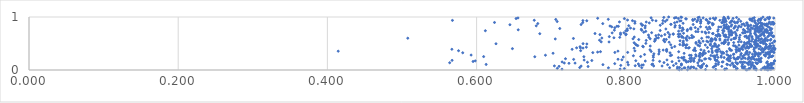
| Category | Series 0 |
|---|---|
| 0.9623171021919199 | 0.001 |
| 0.9747406557323547 | 0.002 |
| 0.9895948987757377 | 0.003 |
| 0.8717175251389123 | 0.004 |
| 0.8827409776190007 | 0.005 |
| 0.9913393225690255 | 0.006 |
| 0.9608940733578318 | 0.007 |
| 0.9814271364665927 | 0.008 |
| 0.9068664954316917 | 0.009 |
| 0.9326719210059154 | 0.01 |
| 0.9944726574568352 | 0.011 |
| 0.9865864142619891 | 0.012 |
| 0.9204823888395895 | 0.013 |
| 0.8750546704846962 | 0.014 |
| 0.9480065491455798 | 0.015 |
| 0.7144841587038178 | 0.016 |
| 0.7923696142282386 | 0.017 |
| 0.972205407511814 | 0.018 |
| 0.964645180021621 | 0.019 |
| 0.8944185041590693 | 0.02 |
| 0.9659850412105353 | 0.021 |
| 0.9329459137267747 | 0.022 |
| 0.869135031206078 | 0.023 |
| 0.9350589281335112 | 0.024 |
| 0.9746266237438452 | 0.025 |
| 0.7980511304339165 | 0.026 |
| 0.8862364519355728 | 0.027 |
| 0.9655324348440759 | 0.028 |
| 0.9493603670472457 | 0.029 |
| 0.70820980556473 | 0.03 |
| 0.9959132565413925 | 0.031 |
| 0.9582505431160309 | 0.032 |
| 0.9974522746776564 | 0.033 |
| 0.9718190202973945 | 0.034 |
| 0.9968156664668084 | 0.035 |
| 0.9875146339542388 | 0.036 |
| 0.992852006151353 | 0.037 |
| 0.9838769126051203 | 0.038 |
| 0.879430409385682 | 0.039 |
| 0.9563827074740291 | 0.04 |
| 0.7767031555499795 | 0.041 |
| 0.8781722413295678 | 0.042 |
| 0.858752318178567 | 0.043 |
| 0.8213729488976601 | 0.044 |
| 0.8913145163075983 | 0.045 |
| 0.738189036426481 | 0.046 |
| 0.8720094785637611 | 0.047 |
| 0.9901740783523252 | 0.048 |
| 0.9000823389358291 | 0.049 |
| 0.901550629968338 | 0.05 |
| 0.9950283732085823 | 0.051 |
| 0.9171286690489323 | 0.052 |
| 0.8905157053189973 | 0.053 |
| 0.8692862677099507 | 0.054 |
| 0.883777177198156 | 0.055 |
| 0.9681171811957827 | 0.056 |
| 0.9573890033942049 | 0.057 |
| 0.887741543517582 | 0.058 |
| 0.986109907274425 | 0.059 |
| 0.9448319364254483 | 0.06 |
| 0.9727542953791875 | 0.061 |
| 0.901876903846437 | 0.062 |
| 0.9595486204015662 | 0.063 |
| 0.9467996678944577 | 0.064 |
| 0.9002018828821146 | 0.065 |
| 0.7494460107641284 | 0.066 |
| 0.9897220579351174 | 0.067 |
| 0.9287786069564016 | 0.068 |
| 0.7105398287959512 | 0.069 |
| 0.9556494420011812 | 0.07 |
| 0.9189533409416853 | 0.071 |
| 0.9085528302026372 | 0.072 |
| 0.971962104768705 | 0.073 |
| 0.7401002572279076 | 0.074 |
| 0.8486193288511875 | 0.075 |
| 0.8373730458030175 | 0.076 |
| 0.7042845908193188 | 0.077 |
| 0.8181570798956572 | 0.078 |
| 0.9083180803463297 | 0.079 |
| 0.9952276723003229 | 0.08 |
| 0.8126287560955953 | 0.081 |
| 0.9207384917934928 | 0.082 |
| 0.897335003783556 | 0.083 |
| 0.9448109345539243 | 0.084 |
| 0.9684124451603641 | 0.085 |
| 0.8639686710516375 | 0.086 |
| 0.793256612609323 | 0.087 |
| 0.9022064757525818 | 0.088 |
| 0.9923580804572758 | 0.089 |
| 0.9908330190778566 | 0.09 |
| 0.9400805765015253 | 0.091 |
| 0.8744944354805781 | 0.092 |
| 0.8214509032997103 | 0.093 |
| 0.9912671017446124 | 0.094 |
| 0.9699162638168138 | 0.095 |
| 0.823451812594991 | 0.096 |
| 0.9916380300341493 | 0.097 |
| 0.8033794882493022 | 0.098 |
| 0.9646386486823598 | 0.099 |
| 0.8560283166008624 | 0.1 |
| 0.7693652457042373 | 0.101 |
| 0.936332315189229 | 0.102 |
| 0.9564513040482068 | 0.103 |
| 0.8349362818269015 | 0.104 |
| 0.6128069580157208 | 0.105 |
| 0.9954770653805188 | 0.106 |
| 0.9239418607885429 | 0.107 |
| 0.8745553616361029 | 0.108 |
| 0.9354507915669162 | 0.109 |
| 0.9911785030127287 | 0.11 |
| 0.8360992602492043 | 0.111 |
| 0.8744563766697384 | 0.112 |
| 0.9677120178402527 | 0.113 |
| 0.8168446358196417 | 0.114 |
| 0.949419500208466 | 0.115 |
| 0.9981077643673135 | 0.116 |
| 0.904402507990802 | 0.117 |
| 0.9207374545474757 | 0.118 |
| 0.9952051277652872 | 0.119 |
| 0.7851628534570525 | 0.12 |
| 0.9428006353074603 | 0.121 |
| 0.8674018352079509 | 0.122 |
| 0.9756192680611138 | 0.123 |
| 0.9943932203333388 | 0.124 |
| 0.9764230527205725 | 0.125 |
| 0.7238270285884756 | 0.126 |
| 0.9497677179717032 | 0.127 |
| 0.9636032887000108 | 0.128 |
| 0.9430386763439812 | 0.129 |
| 0.7319750418950696 | 0.13 |
| 0.9976677351670439 | 0.131 |
| 0.7176094069395006 | 0.132 |
| 0.9624191184293787 | 0.133 |
| 0.8965093738167486 | 0.134 |
| 0.98877732816165 | 0.135 |
| 0.9700727417189179 | 0.136 |
| 0.5639063053985537 | 0.137 |
| 0.9648211120727116 | 0.138 |
| 0.9742678694355028 | 0.139 |
| 0.8511701673877509 | 0.14 |
| 0.9561795174668535 | 0.141 |
| 0.9474611045226818 | 0.142 |
| 0.9245364132184692 | 0.143 |
| 0.9596294175432059 | 0.144 |
| 0.8024030300148874 | 0.145 |
| 0.7485832721935276 | 0.146 |
| 0.9542661012114266 | 0.147 |
| 0.9578027900036609 | 0.148 |
| 0.881379761580431 | 0.149 |
| 0.9531815658848742 | 0.15 |
| 0.9293864886104027 | 0.151 |
| 0.7146346920170109 | 0.152 |
| 0.9670654258154951 | 0.153 |
| 0.9303938028734186 | 0.154 |
| 0.9810513075811355 | 0.155 |
| 0.9897452604131699 | 0.156 |
| 0.9787622420457515 | 0.157 |
| 0.8620182029239735 | 0.158 |
| 0.8838577998714339 | 0.159 |
| 0.9658223570242661 | 0.16 |
| 0.5952861953040963 | 0.161 |
| 0.8912841583687797 | 0.162 |
| 0.8453653778429943 | 0.163 |
| 0.8872105439963486 | 0.164 |
| 0.9807298964556657 | 0.165 |
| 0.8867319858408508 | 0.166 |
| 0.999274374080849 | 0.167 |
| 0.8809362362327201 | 0.168 |
| 0.8261201778190344 | 0.169 |
| 0.9397559192746173 | 0.17 |
| 0.8714227192115594 | 0.171 |
| 0.5981818187261094 | 0.172 |
| 0.8985786720292858 | 0.173 |
| 0.9018751249566416 | 0.174 |
| 0.813410816479047 | 0.175 |
| 0.9994571297483457 | 0.176 |
| 0.9215486012949661 | 0.177 |
| 0.9375773677028879 | 0.178 |
| 0.7544777679440596 | 0.179 |
| 0.9218709125688275 | 0.18 |
| 0.9224036768028829 | 0.181 |
| 0.5671672203813777 | 0.182 |
| 0.8365795420221185 | 0.183 |
| 0.9201306101824852 | 0.184 |
| 0.8907741191613138 | 0.185 |
| 0.9782969067538114 | 0.186 |
| 0.8779519247450639 | 0.187 |
| 0.7441566349024814 | 0.188 |
| 0.8792302531380817 | 0.189 |
| 0.8551905567840165 | 0.19 |
| 0.9769319252743411 | 0.191 |
| 0.7947451553659325 | 0.192 |
| 0.9198630655265986 | 0.193 |
| 0.9800841127188177 | 0.194 |
| 0.9380014721778946 | 0.195 |
| 0.9728680919805304 | 0.196 |
| 0.9752626883464894 | 0.197 |
| 0.8986561116956667 | 0.198 |
| 0.9473557231925827 | 0.199 |
| 0.7300938349458465 | 0.2 |
| 0.9356826834111606 | 0.201 |
| 0.9683160513984529 | 0.202 |
| 0.7895908632888478 | 0.203 |
| 0.9637731427460118 | 0.204 |
| 0.9133536432225104 | 0.205 |
| 0.9783421481849114 | 0.206 |
| 0.9793683599320218 | 0.207 |
| 0.9056707741381134 | 0.208 |
| 0.9551656661748434 | 0.209 |
| 0.8880777229853094 | 0.21 |
| 0.9070310059133708 | 0.211 |
| 0.9501777677584241 | 0.212 |
| 0.7191661486997022 | 0.213 |
| 0.9490064521492896 | 0.214 |
| 0.945560627218099 | 0.215 |
| 0.8858590834009079 | 0.216 |
| 0.9713622452815149 | 0.217 |
| 0.9117565424634698 | 0.218 |
| 0.949810817384953 | 0.219 |
| 0.9601066817891463 | 0.22 |
| 0.8919211240006958 | 0.221 |
| 0.9403649649705264 | 0.222 |
| 0.981562833353997 | 0.223 |
| 0.9370962412439288 | 0.224 |
| 0.8764673228641607 | 0.225 |
| 0.8767542933571675 | 0.226 |
| 0.9663277955692567 | 0.227 |
| 0.9190654770256185 | 0.228 |
| 0.9576403746326465 | 0.229 |
| 0.991316346669738 | 0.23 |
| 0.96567294693632 | 0.231 |
| 0.8747457762014706 | 0.232 |
| 0.8705212757419526 | 0.233 |
| 0.9447054397809272 | 0.234 |
| 0.931819839055573 | 0.235 |
| 0.8878443036063134 | 0.236 |
| 0.950259983141941 | 0.237 |
| 0.9235755151511068 | 0.238 |
| 0.9647531415200777 | 0.239 |
| 0.8369447365486891 | 0.24 |
| 0.9279118435210593 | 0.241 |
| 0.8779978769096145 | 0.242 |
| 0.9523938043702941 | 0.243 |
| 0.9700721068888977 | 0.244 |
| 0.7966493492338929 | 0.245 |
| 0.920003771731342 | 0.246 |
| 0.8994935628284023 | 0.247 |
| 0.9695801711051848 | 0.248 |
| 0.9928888202121999 | 0.249 |
| 0.6780223085672129 | 0.25 |
| 0.7438046785874354 | 0.251 |
| 0.9389284555280845 | 0.252 |
| 0.6094406604966417 | 0.253 |
| 0.9952535711270178 | 0.254 |
| 0.8199231946147361 | 0.255 |
| 0.994863272327541 | 0.256 |
| 0.9567454307997046 | 0.257 |
| 0.9779776465184266 | 0.258 |
| 0.99630381439143 | 0.259 |
| 0.8982823710452098 | 0.26 |
| 0.8941469743174628 | 0.261 |
| 0.9871604140682936 | 0.262 |
| 0.9726975046387105 | 0.263 |
| 0.9170908342759513 | 0.264 |
| 0.9278738752091026 | 0.265 |
| 0.9192699051250406 | 0.266 |
| 0.997193834581434 | 0.267 |
| 0.9404234419164634 | 0.268 |
| 0.8101548516680317 | 0.269 |
| 0.9377023063002525 | 0.27 |
| 0.8368906884591492 | 0.271 |
| 0.8597195190872771 | 0.272 |
| 0.9140672487799405 | 0.273 |
| 0.9026513746955949 | 0.274 |
| 0.8984094469744726 | 0.275 |
| 0.9733369412372919 | 0.276 |
| 0.8854119841052089 | 0.277 |
| 0.8876557428219899 | 0.278 |
| 0.6922829438955932 | 0.279 |
| 0.8613290826898503 | 0.28 |
| 0.9588559384708554 | 0.281 |
| 0.5926620306555591 | 0.282 |
| 0.9855847963279057 | 0.283 |
| 0.9221458558985155 | 0.284 |
| 0.9540607703301839 | 0.285 |
| 0.9644133966646258 | 0.286 |
| 0.893694061664823 | 0.287 |
| 0.9875065102819928 | 0.288 |
| 0.977484083341017 | 0.289 |
| 0.935624392224458 | 0.29 |
| 0.9920814820060264 | 0.291 |
| 0.8251613603771011 | 0.292 |
| 0.9735155484849944 | 0.293 |
| 0.9441884482239455 | 0.294 |
| 0.9775653795994088 | 0.295 |
| 0.904164657472954 | 0.296 |
| 0.992565128692091 | 0.297 |
| 0.9800383730047943 | 0.298 |
| 0.9698408017986667 | 0.299 |
| 0.9449418528973346 | 0.3 |
| 0.903261533530312 | 0.301 |
| 0.8441888971537328 | 0.302 |
| 0.9613341076515183 | 0.303 |
| 0.9898767498723523 | 0.304 |
| 0.9742387312797501 | 0.305 |
| 0.8376678192373866 | 0.306 |
| 0.9001510361703876 | 0.307 |
| 0.9735079523210072 | 0.308 |
| 0.9803883124469166 | 0.309 |
| 0.8997198604893878 | 0.31 |
| 0.9288892887346667 | 0.311 |
| 0.954776959173555 | 0.312 |
| 0.899487314139971 | 0.313 |
| 0.8781714434586686 | 0.314 |
| 0.9750751322182978 | 0.315 |
| 0.7025093517955548 | 0.316 |
| 0.9314236945204531 | 0.317 |
| 0.9066889683442864 | 0.318 |
| 0.9780397703918858 | 0.319 |
| 0.9607959166329306 | 0.32 |
| 0.9901277215762986 | 0.321 |
| 0.9627003367917528 | 0.322 |
| 0.9876110538723348 | 0.323 |
| 0.8592562482992995 | 0.324 |
| 0.5813936628955948 | 0.325 |
| 0.9896496578903315 | 0.326 |
| 0.9159628978978699 | 0.327 |
| 0.7557689928263147 | 0.328 |
| 0.9661442217232942 | 0.329 |
| 0.9986326676820337 | 0.33 |
| 0.7853485007490797 | 0.331 |
| 0.8025428539912068 | 0.332 |
| 0.9939454803933644 | 0.333 |
| 0.9040102100158718 | 0.334 |
| 0.9223738606408703 | 0.335 |
| 0.9299549534549396 | 0.336 |
| 0.9827369682065333 | 0.337 |
| 0.762235052709559 | 0.338 |
| 0.9481424614612068 | 0.339 |
| 0.9922299919421947 | 0.34 |
| 0.9974861036955619 | 0.341 |
| 0.984224095635406 | 0.342 |
| 0.8448723728392621 | 0.343 |
| 0.9728622211684995 | 0.344 |
| 0.8709185654625136 | 0.345 |
| 0.7660622575870332 | 0.346 |
| 0.92697503192385 | 0.347 |
| 0.911073953800782 | 0.348 |
| 0.9353623923120121 | 0.349 |
| 0.8340353042125992 | 0.35 |
| 0.9724096402623796 | 0.351 |
| 0.8548469254521991 | 0.352 |
| 0.9626248656735368 | 0.353 |
| 0.9622317544065602 | 0.354 |
| 0.4144857685913823 | 0.355 |
| 0.7894900357652568 | 0.356 |
| 0.9157757948965741 | 0.357 |
| 0.9231067688740331 | 0.358 |
| 0.9955175491821857 | 0.359 |
| 0.9204761420584558 | 0.36 |
| 0.812234976753922 | 0.361 |
| 0.9525971960055384 | 0.362 |
| 0.8933811592944205 | 0.363 |
| 0.5758143629004565 | 0.364 |
| 0.7394729094511923 | 0.365 |
| 0.9050011103941197 | 0.366 |
| 0.995134652663574 | 0.367 |
| 0.9951107734956424 | 0.368 |
| 0.9511717610633147 | 0.369 |
| 0.9417520348564682 | 0.37 |
| 0.9491051385457157 | 0.371 |
| 0.8907727454850652 | 0.372 |
| 0.8546191864476756 | 0.373 |
| 0.9846532907947252 | 0.374 |
| 0.9399599442000579 | 0.375 |
| 0.8501029826752423 | 0.376 |
| 0.9220054203055924 | 0.377 |
| 0.8921115378831099 | 0.378 |
| 0.9404396400458778 | 0.379 |
| 0.8445983238426278 | 0.38 |
| 0.8324013216394454 | 0.381 |
| 0.9007337383681668 | 0.382 |
| 0.9813489370834647 | 0.383 |
| 0.9995004602389648 | 0.384 |
| 0.9477764269962318 | 0.385 |
| 0.9718148723110704 | 0.386 |
| 0.9568644046345147 | 0.387 |
| 0.8547420291051253 | 0.388 |
| 0.9395800905368379 | 0.389 |
| 0.7280599603449569 | 0.39 |
| 0.5668644529611616 | 0.391 |
| 0.9984280531620554 | 0.392 |
| 0.9249858247908266 | 0.393 |
| 0.9915091305394632 | 0.394 |
| 0.9865942167625935 | 0.395 |
| 0.9855121849808205 | 0.396 |
| 0.9517040051233362 | 0.397 |
| 0.95165691800968 | 0.398 |
| 0.954224034754819 | 0.399 |
| 0.9785188113318322 | 0.4 |
| 0.9151106581051693 | 0.401 |
| 0.9999741392984134 | 0.402 |
| 0.6480353742177841 | 0.403 |
| 0.998227365445026 | 0.404 |
| 0.9388861000831965 | 0.405 |
| 0.9552056144749408 | 0.406 |
| 0.9828217062161628 | 0.407 |
| 0.9964389593440388 | 0.408 |
| 0.9607875749832318 | 0.409 |
| 0.9874648456047526 | 0.41 |
| 0.8111660571426745 | 0.411 |
| 0.9643698660073264 | 0.412 |
| 0.8924862773541672 | 0.413 |
| 0.7426664429702238 | 0.414 |
| 0.8838579590734182 | 0.415 |
| 0.9936637115815524 | 0.416 |
| 0.7391884758723936 | 0.417 |
| 0.7340481666846946 | 0.418 |
| 0.9721517447963297 | 0.419 |
| 0.8805961311417265 | 0.42 |
| 0.885105587260702 | 0.421 |
| 0.8617764225790171 | 0.422 |
| 0.9985922077223991 | 0.423 |
| 0.9094448615010557 | 0.424 |
| 0.9885569710817365 | 0.425 |
| 0.9741404242186155 | 0.426 |
| 0.9487899667537087 | 0.427 |
| 0.9869963375213793 | 0.428 |
| 0.9903548128535696 | 0.429 |
| 0.7471122260250312 | 0.43 |
| 0.9626927388246276 | 0.431 |
| 0.9658320431943264 | 0.432 |
| 0.9229706578212544 | 0.433 |
| 0.9556584381264462 | 0.434 |
| 0.9477260021561735 | 0.435 |
| 0.9752536494785555 | 0.436 |
| 0.9585330835892327 | 0.437 |
| 0.8235073825662268 | 0.438 |
| 0.9656756830942297 | 0.439 |
| 0.7386736607450084 | 0.44 |
| 0.9802772852144014 | 0.441 |
| 0.9213297539987884 | 0.442 |
| 0.9157947694769544 | 0.443 |
| 0.8656169127774805 | 0.444 |
| 0.9626830098165101 | 0.445 |
| 0.918185480546576 | 0.446 |
| 0.8226550886852281 | 0.447 |
| 0.9684689854313506 | 0.448 |
| 0.992351680721069 | 0.449 |
| 0.9940726421393083 | 0.45 |
| 0.9690637870682206 | 0.451 |
| 0.8327473131863227 | 0.452 |
| 0.9941777232853511 | 0.453 |
| 0.8988625797907606 | 0.454 |
| 0.9574196541378748 | 0.455 |
| 0.9464001104884747 | 0.456 |
| 0.9980090828559504 | 0.457 |
| 0.9782885969370932 | 0.458 |
| 0.9755302445268572 | 0.459 |
| 0.8160645362747778 | 0.46 |
| 0.944252614700311 | 0.461 |
| 0.974906578979702 | 0.462 |
| 0.92466540510118 | 0.463 |
| 0.8806399742568018 | 0.464 |
| 0.8764599759653738 | 0.465 |
| 0.95786293241289 | 0.466 |
| 0.8968080407413324 | 0.467 |
| 0.951645341120223 | 0.468 |
| 0.9767385776986013 | 0.469 |
| 0.8144591951541297 | 0.47 |
| 0.9066137922211386 | 0.471 |
| 0.8776423305610597 | 0.472 |
| 0.9131192365420557 | 0.473 |
| 0.9880075118362897 | 0.474 |
| 0.9193723918571268 | 0.475 |
| 0.8602171259399222 | 0.476 |
| 0.8818529941730048 | 0.477 |
| 0.9882788083032351 | 0.478 |
| 0.9593919605187603 | 0.479 |
| 0.8725062767076271 | 0.48 |
| 0.9667048404360538 | 0.481 |
| 0.9200518916297831 | 0.482 |
| 0.9373042324343713 | 0.483 |
| 0.9731896805325541 | 0.484 |
| 0.967248250162515 | 0.485 |
| 0.8130557810273682 | 0.486 |
| 0.9727988626080961 | 0.487 |
| 0.8778712277505104 | 0.488 |
| 0.9136270047631027 | 0.489 |
| 0.9659750168222409 | 0.49 |
| 0.7478033575163373 | 0.491 |
| 0.976485840121418 | 0.492 |
| 0.9750987052809064 | 0.493 |
| 0.9933832585096435 | 0.494 |
| 0.6260008788841602 | 0.495 |
| 0.9872338989313928 | 0.496 |
| 0.7427246690705369 | 0.497 |
| 0.9193150482586967 | 0.498 |
| 0.9843164248882441 | 0.499 |
| 0.9312505693030634 | 0.5 |
| 0.894268829096236 | 0.501 |
| 0.8268696235158256 | 0.502 |
| 0.9620134802614648 | 0.503 |
| 0.9319992505605785 | 0.504 |
| 0.8999736736426558 | 0.505 |
| 0.9619718348973573 | 0.506 |
| 0.9286712435274185 | 0.507 |
| 0.9307611551909901 | 0.508 |
| 0.9740625564304165 | 0.509 |
| 0.9965609922829083 | 0.51 |
| 0.9631592982861954 | 0.511 |
| 0.9379210028274486 | 0.512 |
| 0.9631608949971341 | 0.513 |
| 0.8111735726085137 | 0.514 |
| 0.8767197278736854 | 0.515 |
| 0.9808657586131827 | 0.516 |
| 0.9446499344650036 | 0.517 |
| 0.9588479585128276 | 0.518 |
| 0.9805206258468796 | 0.519 |
| 0.8940925800432205 | 0.52 |
| 0.9315200649129343 | 0.521 |
| 0.9720211110301873 | 0.522 |
| 0.982650199443754 | 0.523 |
| 0.8581133427127303 | 0.524 |
| 0.9851402247753328 | 0.525 |
| 0.9335424636556627 | 0.526 |
| 0.8982270103186315 | 0.527 |
| 0.9103311590375732 | 0.528 |
| 0.7775424461515755 | 0.529 |
| 0.9509941113102894 | 0.53 |
| 0.7670312391458513 | 0.531 |
| 0.9546415548883564 | 0.532 |
| 0.8522565219138749 | 0.533 |
| 0.9329637238920975 | 0.534 |
| 0.9828474108831092 | 0.535 |
| 0.972917827175685 | 0.536 |
| 0.9994382502239354 | 0.537 |
| 0.9653843947203534 | 0.538 |
| 0.9728762838125853 | 0.539 |
| 0.9655506782877296 | 0.54 |
| 0.9150117509967051 | 0.541 |
| 0.8385816275126364 | 0.542 |
| 0.9035859470550575 | 0.543 |
| 0.9085769033694665 | 0.544 |
| 0.9685806493685396 | 0.545 |
| 0.8771481699515653 | 0.546 |
| 0.9135982296539724 | 0.547 |
| 0.9871390642199049 | 0.548 |
| 0.9993318132141781 | 0.549 |
| 0.8981163788593188 | 0.55 |
| 0.8727242477435442 | 0.551 |
| 0.9752808327368546 | 0.552 |
| 0.9847298340401586 | 0.553 |
| 0.9779464317396352 | 0.554 |
| 0.9839500445295968 | 0.555 |
| 0.8508214006544697 | 0.556 |
| 0.9900923380443168 | 0.557 |
| 0.8273729570575161 | 0.558 |
| 0.9329231675006803 | 0.559 |
| 0.8819753394857331 | 0.56 |
| 0.993760784832283 | 0.561 |
| 0.7648215765941162 | 0.562 |
| 0.9740242145295216 | 0.563 |
| 0.8395420762937958 | 0.564 |
| 0.9262550374968116 | 0.565 |
| 0.9206446236271634 | 0.566 |
| 0.9331200369696578 | 0.567 |
| 0.9366030900469937 | 0.568 |
| 0.9898485669811828 | 0.569 |
| 0.9162740168714949 | 0.57 |
| 0.9744568745243392 | 0.571 |
| 0.9412923101313996 | 0.572 |
| 0.9802536361688297 | 0.573 |
| 0.8173443357077528 | 0.574 |
| 0.914602633246495 | 0.575 |
| 0.9523553826084585 | 0.576 |
| 0.8542841619341728 | 0.577 |
| 0.8513667381741556 | 0.578 |
| 0.9204671570942051 | 0.579 |
| 0.9945452533968762 | 0.58 |
| 0.8391640219677485 | 0.581 |
| 0.9863182918337174 | 0.582 |
| 0.96993073781206 | 0.583 |
| 0.9653838593272214 | 0.584 |
| 0.9142628552964118 | 0.585 |
| 0.7054506998507126 | 0.586 |
| 0.9260360337998497 | 0.587 |
| 0.8096681242526899 | 0.588 |
| 0.8326850906421477 | 0.589 |
| 0.9820569095407243 | 0.59 |
| 0.9151885716430844 | 0.591 |
| 0.8807467161333962 | 0.592 |
| 0.9452287134140008 | 0.593 |
| 0.9196931795429173 | 0.594 |
| 0.7297769866966531 | 0.595 |
| 0.9449640184168617 | 0.596 |
| 0.9470734149117338 | 0.597 |
| 0.9017177871537524 | 0.598 |
| 0.9778615019593837 | 0.599 |
| 0.5077611199360021 | 0.6 |
| 0.8805332895877416 | 0.601 |
| 0.9874563083968086 | 0.602 |
| 0.7678871975379378 | 0.603 |
| 0.8854002968869205 | 0.604 |
| 0.8415742371154734 | 0.605 |
| 0.962457474089988 | 0.606 |
| 0.8436383828701505 | 0.607 |
| 0.7840599667158346 | 0.608 |
| 0.9754754814120234 | 0.609 |
| 0.8887697534338266 | 0.61 |
| 0.9468526414619998 | 0.611 |
| 0.9522136682109794 | 0.612 |
| 0.876933216417821 | 0.613 |
| 0.9378089453387154 | 0.614 |
| 0.9642944101824813 | 0.615 |
| 0.7918812655176978 | 0.616 |
| 0.9689870270306957 | 0.617 |
| 0.831000540780624 | 0.618 |
| 0.9108941702763041 | 0.619 |
| 0.8749434161807583 | 0.62 |
| 0.9086719044090436 | 0.621 |
| 0.8113558585800854 | 0.622 |
| 0.8581578269413005 | 0.623 |
| 0.8907909166606329 | 0.624 |
| 0.9346623642297838 | 0.625 |
| 0.8709857750866713 | 0.626 |
| 0.934034303764575 | 0.627 |
| 0.9979068189944336 | 0.628 |
| 0.9904388644661957 | 0.629 |
| 0.7779024673038556 | 0.63 |
| 0.9778429671835873 | 0.631 |
| 0.969057594522465 | 0.632 |
| 0.9596319420495242 | 0.633 |
| 0.8709977937890238 | 0.634 |
| 0.9228178045867875 | 0.635 |
| 0.8823740386556644 | 0.636 |
| 0.9967710423326367 | 0.637 |
| 0.8748717618842354 | 0.638 |
| 0.9321481082074679 | 0.639 |
| 0.9615804786484419 | 0.64 |
| 0.9980508063597097 | 0.641 |
| 0.9262695735709582 | 0.642 |
| 0.9329106662898341 | 0.643 |
| 0.8477700802588518 | 0.644 |
| 0.980378496385256 | 0.645 |
| 0.9749726066501064 | 0.646 |
| 0.9658879455437285 | 0.647 |
| 0.985586337486836 | 0.648 |
| 0.8403738916267488 | 0.649 |
| 0.9918388179688139 | 0.65 |
| 0.9484215497173363 | 0.651 |
| 0.888400549008162 | 0.652 |
| 0.9394188124149866 | 0.653 |
| 0.9208104490802919 | 0.654 |
| 0.925854510661014 | 0.655 |
| 0.9532758651743055 | 0.656 |
| 0.9946919721842576 | 0.657 |
| 0.9315330286597848 | 0.658 |
| 0.8304101795153574 | 0.659 |
| 0.9337858124224444 | 0.66 |
| 0.9419423189988549 | 0.661 |
| 0.9744447543675503 | 0.662 |
| 0.8440363747527883 | 0.663 |
| 0.9812076664668152 | 0.664 |
| 0.981008500115985 | 0.665 |
| 0.7999398817235461 | 0.666 |
| 0.8588143405595523 | 0.667 |
| 0.7653459886180548 | 0.668 |
| 0.8523740789330779 | 0.669 |
| 0.7929849638340251 | 0.67 |
| 0.9238089514899172 | 0.671 |
| 0.9245340542066932 | 0.672 |
| 0.8703287413250961 | 0.673 |
| 0.8636161736460964 | 0.674 |
| 0.8005330919321839 | 0.675 |
| 0.9385052496891074 | 0.676 |
| 0.9828637245282569 | 0.677 |
| 0.872574057526707 | 0.678 |
| 0.9414553588539427 | 0.679 |
| 0.9846410761919925 | 0.68 |
| 0.947445638838303 | 0.681 |
| 0.8635266662395696 | 0.682 |
| 0.9673552190507891 | 0.683 |
| 0.9850156226763952 | 0.684 |
| 0.6847334685207027 | 0.685 |
| 0.9730030861417517 | 0.686 |
| 0.9163200156534317 | 0.687 |
| 0.7587192784496638 | 0.688 |
| 0.9170261005926562 | 0.689 |
| 0.9931630278315654 | 0.69 |
| 0.991724449315896 | 0.691 |
| 0.9952820317170362 | 0.692 |
| 0.8774116713379745 | 0.693 |
| 0.9072583928497545 | 0.694 |
| 0.973063335416825 | 0.695 |
| 0.7929253815239549 | 0.696 |
| 0.9834325315116433 | 0.697 |
| 0.9301702739650884 | 0.698 |
| 0.9572928446088304 | 0.699 |
| 0.7817252184093995 | 0.7 |
| 0.959852306035162 | 0.701 |
| 0.7975168315026822 | 0.702 |
| 0.9565847256199441 | 0.703 |
| 0.8346286211144188 | 0.704 |
| 0.9435004960958935 | 0.705 |
| 0.9957755631259012 | 0.706 |
| 0.8566009382659847 | 0.707 |
| 0.9113031375435687 | 0.708 |
| 0.9848975669391568 | 0.709 |
| 0.9786307084556118 | 0.71 |
| 0.9600441750395505 | 0.711 |
| 0.9892334049186314 | 0.712 |
| 0.8240825709615288 | 0.713 |
| 0.9466352890079398 | 0.714 |
| 0.9064995011071078 | 0.715 |
| 0.9732431414372331 | 0.716 |
| 0.9887570621593448 | 0.717 |
| 0.9668523016892777 | 0.718 |
| 0.9021277110796131 | 0.719 |
| 0.938095226061933 | 0.72 |
| 0.9406673027674779 | 0.721 |
| 0.9634728682596763 | 0.722 |
| 0.9603883340005797 | 0.723 |
| 0.896808797986868 | 0.724 |
| 0.8938980297917998 | 0.725 |
| 0.9410823725954339 | 0.726 |
| 0.9743462844931816 | 0.727 |
| 0.9865472635421945 | 0.728 |
| 0.8267688358678603 | 0.729 |
| 0.9795961264206604 | 0.73 |
| 0.9232913761374831 | 0.731 |
| 0.8708005311619416 | 0.732 |
| 0.9763298170044926 | 0.733 |
| 0.980252450332906 | 0.734 |
| 0.9316462928086313 | 0.735 |
| 0.9820246913825474 | 0.736 |
| 0.9900866997303482 | 0.737 |
| 0.7999405203287809 | 0.738 |
| 0.874976448928469 | 0.739 |
| 0.8824029297621193 | 0.74 |
| 0.6117578290728908 | 0.741 |
| 0.9595146344445376 | 0.742 |
| 0.9763350397076801 | 0.743 |
| 0.9410848733929656 | 0.744 |
| 0.8461102944148516 | 0.745 |
| 0.8020957265460227 | 0.746 |
| 0.9298297518980387 | 0.747 |
| 0.9941302958976259 | 0.748 |
| 0.8214692628274519 | 0.749 |
| 0.9777725299528658 | 0.75 |
| 0.7847037004547389 | 0.751 |
| 0.9862742243068369 | 0.752 |
| 0.9494153836337145 | 0.753 |
| 0.9872349537884539 | 0.754 |
| 0.9579899375432573 | 0.755 |
| 0.9671452193160538 | 0.756 |
| 0.9378114321984699 | 0.757 |
| 0.6557804207900783 | 0.758 |
| 0.9729258670897443 | 0.759 |
| 0.9937659747927513 | 0.76 |
| 0.9238327457584605 | 0.761 |
| 0.882597441738098 | 0.762 |
| 0.9651904956620216 | 0.763 |
| 0.9576366918485969 | 0.764 |
| 0.9887746929553073 | 0.765 |
| 0.8770074686851682 | 0.766 |
| 0.9816864097015993 | 0.767 |
| 0.9097900516240319 | 0.768 |
| 0.8207237392882618 | 0.769 |
| 0.9819118436652615 | 0.77 |
| 0.8875576664759183 | 0.771 |
| 0.9739084301114207 | 0.772 |
| 0.8969219448331814 | 0.773 |
| 0.8537002261330926 | 0.774 |
| 0.801993252281169 | 0.775 |
| 0.8108322762208109 | 0.776 |
| 0.9797293875856269 | 0.777 |
| 0.9957279893588592 | 0.778 |
| 0.9358335140103552 | 0.779 |
| 0.8865355897180329 | 0.78 |
| 0.9130739045583266 | 0.781 |
| 0.9764713918208888 | 0.782 |
| 0.711499368238944 | 0.783 |
| 0.9314969260237578 | 0.784 |
| 0.9701254728143085 | 0.785 |
| 0.9633405483496169 | 0.786 |
| 0.944948508907034 | 0.787 |
| 0.9938094530036642 | 0.788 |
| 0.937686005251603 | 0.789 |
| 0.9842593798122725 | 0.79 |
| 0.8063136741032725 | 0.791 |
| 0.9740468143542428 | 0.792 |
| 0.8760820767713877 | 0.793 |
| 0.8258523629450855 | 0.794 |
| 0.8872888000846226 | 0.795 |
| 0.872473220087274 | 0.796 |
| 0.7852135135025888 | 0.797 |
| 0.9340908188247383 | 0.798 |
| 0.9679453257948717 | 0.799 |
| 0.8930846121478264 | 0.8 |
| 0.9504532123396393 | 0.801 |
| 0.9789172213745108 | 0.802 |
| 0.9346409168775681 | 0.803 |
| 0.9324028178709428 | 0.804 |
| 0.9759216699226775 | 0.805 |
| 0.9079737175113183 | 0.806 |
| 0.9460010160288902 | 0.807 |
| 0.9920072799310753 | 0.808 |
| 0.8657684067290695 | 0.809 |
| 0.9119855364769247 | 0.81 |
| 0.924647036479842 | 0.811 |
| 0.9381756834036644 | 0.812 |
| 0.9276559658178197 | 0.813 |
| 0.9544676729239976 | 0.814 |
| 0.7811315276056586 | 0.815 |
| 0.9001958241455744 | 0.816 |
| 0.9347367915475945 | 0.817 |
| 0.9827480136647282 | 0.818 |
| 0.9762688474812035 | 0.819 |
| 0.9373954803103041 | 0.82 |
| 0.9639472409392698 | 0.821 |
| 0.9799132392915778 | 0.822 |
| 0.990127760548573 | 0.823 |
| 0.7900514320778832 | 0.824 |
| 0.7880155927536308 | 0.825 |
| 0.9411585637356016 | 0.826 |
| 0.9647932089405044 | 0.827 |
| 0.9470011377974871 | 0.828 |
| 0.9715860561388315 | 0.829 |
| 0.778782850819824 | 0.83 |
| 0.9517927170696894 | 0.831 |
| 0.8261497252556488 | 0.832 |
| 0.679980531188846 | 0.833 |
| 0.8722659473599956 | 0.834 |
| 0.9739567097044848 | 0.835 |
| 0.8039565657353694 | 0.836 |
| 0.9886515841430792 | 0.837 |
| 0.8663839620175476 | 0.838 |
| 0.9596437783049808 | 0.839 |
| 0.9319007309311249 | 0.84 |
| 0.9816569727660722 | 0.841 |
| 0.8219507658534884 | 0.842 |
| 0.9317147584413906 | 0.843 |
| 0.8461955500159615 | 0.844 |
| 0.9674372851345434 | 0.845 |
| 0.9825858992466144 | 0.846 |
| 0.9631049423958074 | 0.847 |
| 0.8224837353714244 | 0.848 |
| 0.986420861627839 | 0.849 |
| 0.9879836848193664 | 0.85 |
| 0.9163712810157534 | 0.851 |
| 0.9638886530992946 | 0.852 |
| 0.942047682897954 | 0.853 |
| 0.6446467240927429 | 0.854 |
| 0.9828998392469585 | 0.855 |
| 0.9762940316056374 | 0.856 |
| 0.9349427011089427 | 0.857 |
| 0.7400813907585575 | 0.858 |
| 0.8903276889000192 | 0.859 |
| 0.9557405450254576 | 0.86 |
| 0.9976014533743855 | 0.861 |
| 0.8605910461581265 | 0.862 |
| 0.8604138041991591 | 0.863 |
| 0.9945904096464647 | 0.864 |
| 0.9861463600275658 | 0.865 |
| 0.9173644902131008 | 0.866 |
| 0.9824940979844433 | 0.867 |
| 0.9885498933208632 | 0.868 |
| 0.9818807298819106 | 0.869 |
| 0.9578700814107194 | 0.87 |
| 0.9909176871732808 | 0.871 |
| 0.8204873375471424 | 0.872 |
| 0.983451920045795 | 0.873 |
| 0.982201900956818 | 0.874 |
| 0.7691234140820816 | 0.875 |
| 0.682036275556129 | 0.876 |
| 0.998703636378072 | 0.877 |
| 0.9158877825565418 | 0.878 |
| 0.8493457342444253 | 0.879 |
| 0.9105574350404462 | 0.88 |
| 0.8768151818535123 | 0.881 |
| 0.8122256370840156 | 0.882 |
| 0.9002454875728823 | 0.883 |
| 0.9917422166090412 | 0.884 |
| 0.9781133052159335 | 0.885 |
| 0.9740386969189083 | 0.886 |
| 0.961984103942548 | 0.887 |
| 0.8315241672507194 | 0.888 |
| 0.9625734202362497 | 0.889 |
| 0.9464238304606198 | 0.89 |
| 0.8653998267441061 | 0.891 |
| 0.949437247730747 | 0.892 |
| 0.9287165973115161 | 0.893 |
| 0.7422435620410128 | 0.894 |
| 0.9397262845205978 | 0.895 |
| 0.9298502579829881 | 0.896 |
| 0.624013300201857 | 0.897 |
| 0.9803952537297748 | 0.898 |
| 0.9961525130414893 | 0.899 |
| 0.9121662934104842 | 0.9 |
| 0.9974693658551093 | 0.901 |
| 0.9316353797614836 | 0.902 |
| 0.9326297143697662 | 0.903 |
| 0.9927109582613699 | 0.904 |
| 0.8273767758821722 | 0.905 |
| 0.8686693652776595 | 0.906 |
| 0.7914806320826212 | 0.907 |
| 0.9726719945679473 | 0.908 |
| 0.9498741421952621 | 0.909 |
| 0.9452840794568732 | 0.91 |
| 0.9004496652815979 | 0.911 |
| 0.9103161392806584 | 0.912 |
| 0.8953305978468244 | 0.913 |
| 0.8121421127703194 | 0.914 |
| 0.7079804529760179 | 0.915 |
| 0.852893291345395 | 0.916 |
| 0.9343673889926936 | 0.917 |
| 0.9540522565020269 | 0.918 |
| 0.9004164726373964 | 0.919 |
| 0.9303613120542493 | 0.92 |
| 0.9416301765047508 | 0.921 |
| 0.9313738592969806 | 0.922 |
| 0.9422748111925617 | 0.923 |
| 0.9421072302895517 | 0.924 |
| 0.9694604387483526 | 0.925 |
| 0.872267835000152 | 0.926 |
| 0.8740168178916432 | 0.927 |
| 0.8405018800939652 | 0.928 |
| 0.747703921758477 | 0.929 |
| 0.9770651481299503 | 0.93 |
| 0.8089454522050544 | 0.931 |
| 0.7425334355637935 | 0.932 |
| 0.8497919216386565 | 0.933 |
| 0.8899827786550605 | 0.934 |
| 0.972687758939059 | 0.935 |
| 0.5676228231542062 | 0.936 |
| 0.9260833070591846 | 0.937 |
| 0.6773106619579063 | 0.938 |
| 0.9337067490332688 | 0.939 |
| 0.8356827378038525 | 0.94 |
| 0.8964770890268597 | 0.941 |
| 0.8023480530016673 | 0.942 |
| 0.9806024400520262 | 0.943 |
| 0.9669658006390696 | 0.944 |
| 0.855286972451263 | 0.945 |
| 0.908357310292055 | 0.946 |
| 0.9004671151418779 | 0.947 |
| 0.9301078519238513 | 0.948 |
| 0.9863647565243931 | 0.949 |
| 0.987112419354371 | 0.95 |
| 0.9076579488256143 | 0.951 |
| 0.8896921224987999 | 0.952 |
| 0.9193383072894121 | 0.953 |
| 0.7061218862448224 | 0.954 |
| 0.9514930735487113 | 0.955 |
| 0.7765308671984283 | 0.956 |
| 0.8925344939579789 | 0.957 |
| 0.9784966927199231 | 0.958 |
| 0.9685463232522723 | 0.959 |
| 0.9675089680986738 | 0.96 |
| 0.9661238926552851 | 0.961 |
| 0.991836096280145 | 0.962 |
| 0.9314964583644841 | 0.963 |
| 0.881149451158476 | 0.964 |
| 0.9333120516689858 | 0.965 |
| 0.9810756583539867 | 0.966 |
| 0.8802183028787861 | 0.967 |
| 0.9815249968953617 | 0.968 |
| 0.9129671206579638 | 0.969 |
| 0.7980558938892666 | 0.97 |
| 0.6529298577755503 | 0.971 |
| 0.8704165653233333 | 0.972 |
| 0.9703921142450921 | 0.973 |
| 0.9437785060366368 | 0.974 |
| 0.9377262273184898 | 0.975 |
| 0.762286766810041 | 0.976 |
| 0.9924837224536175 | 0.977 |
| 0.9172500888901501 | 0.978 |
| 0.9982884940856619 | 0.979 |
| 0.9206201958009653 | 0.98 |
| 0.8651994168187499 | 0.981 |
| 0.6554696483954967 | 0.982 |
| 0.9317372782145421 | 0.983 |
| 0.9037101967708612 | 0.984 |
| 0.8339010049045 | 0.985 |
| 0.9897634705230428 | 0.986 |
| 0.9721616480119905 | 0.987 |
| 0.8967905000753843 | 0.988 |
| 0.8673350311329384 | 0.989 |
| 0.9925298142487866 | 0.99 |
| 0.9485175398351313 | 0.991 |
| 0.8509595060941971 | 0.992 |
| 0.9925527575249807 | 0.993 |
| 0.8748056460038189 | 0.994 |
| 0.9314236825916044 | 0.995 |
| 0.8983924123229756 | 0.996 |
| 0.8737576902400468 | 0.997 |
| 0.9839120668627303 | 0.998 |
| 0.9371590906523214 | 0.999 |
| 0.8574453779067959 | 1 |